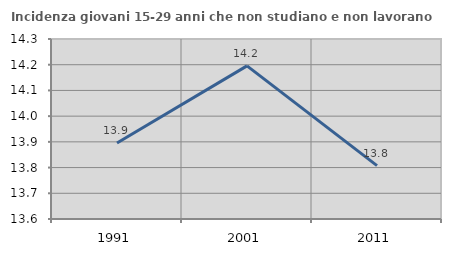
| Category | Incidenza giovani 15-29 anni che non studiano e non lavorano  |
|---|---|
| 1991.0 | 13.895 |
| 2001.0 | 14.196 |
| 2011.0 | 13.808 |